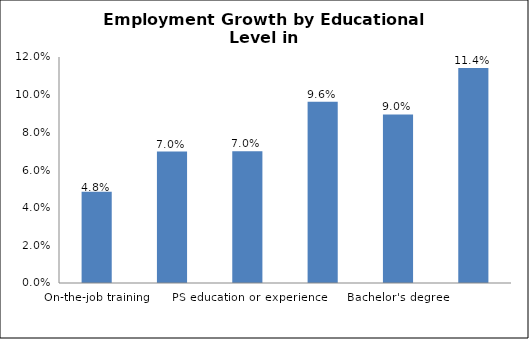
| Category | Series 0 |
|---|---|
| On-the-job training | 0.048 |
| Long-term training | 0.07 |
| PS education or experience | 0.07 |
| Associate degree | 0.096 |
| Bachelor's degree | 0.09 |
| Advanced degree | 0.114 |